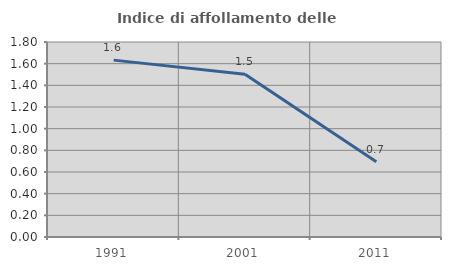
| Category | Indice di affollamento delle abitazioni  |
|---|---|
| 1991.0 | 1.633 |
| 2001.0 | 1.502 |
| 2011.0 | 0.694 |